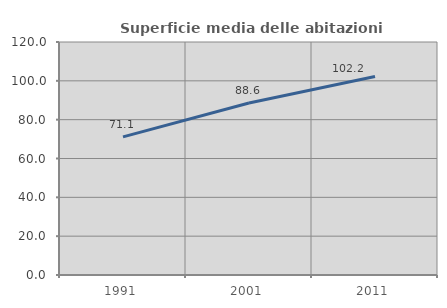
| Category | Superficie media delle abitazioni occupate |
|---|---|
| 1991.0 | 71.116 |
| 2001.0 | 88.614 |
| 2011.0 | 102.234 |